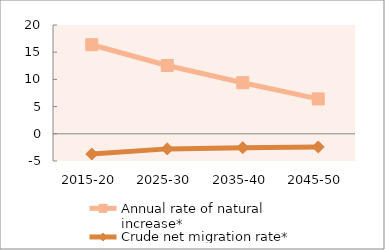
| Category | Annual rate of natural increase* | Crude net migration rate* |
|---|---|---|
| 2015-20 | 16.375 | -3.715 |
| 2025-30 | 12.55 | -2.772 |
| 2035-40 | 9.392 | -2.552 |
| 2045-50 | 6.411 | -2.418 |